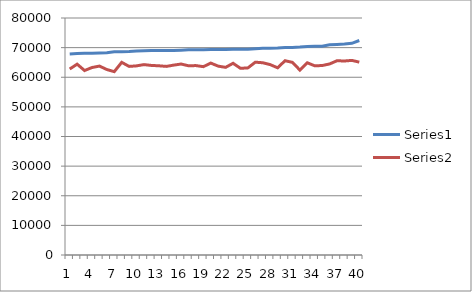
| Category | Series 0 | Series 1 |
|---|---|---|
| 0 | 67889 | 62783 |
| 1 | 68037 | 64415 |
| 2 | 68071 | 62265 |
| 3 | 68109 | 63281 |
| 4 | 68165 | 63775 |
| 5 | 68246 | 62610 |
| 6 | 68567 | 61885 |
| 7 | 68624 | 65034 |
| 8 | 68694 | 63662 |
| 9 | 68838 | 63842 |
| 10 | 68962 | 64268 |
| 11 | 69001 | 63987 |
| 12 | 69006 | 63870 |
| 13 | 69015 | 63663 |
| 14 | 69043 | 64089 |
| 15 | 69149 | 64463 |
| 16 | 69276 | 63872 |
| 17 | 69276 | 63938 |
| 18 | 69302 | 63574 |
| 19 | 69326 | 64782 |
| 20 | 69328 | 63748 |
| 21 | 69376 | 63342 |
| 22 | 69449 | 64715 |
| 23 | 69456 | 63010 |
| 24 | 69464 | 63162 |
| 25 | 69633 | 65087 |
| 26 | 69807 | 64893 |
| 27 | 69831 | 64265 |
| 28 | 69894 | 63194 |
| 29 | 70030 | 65582 |
| 30 | 70056 | 65024 |
| 31 | 70186 | 62420 |
| 32 | 70381 | 64875 |
| 33 | 70463 | 63863 |
| 34 | 70466 | 63956 |
| 35 | 70959 | 64489 |
| 36 | 71080 | 65574 |
| 37 | 71221 | 65487 |
| 38 | 71449 | 65689 |
| 39 | 72409 | 65103 |